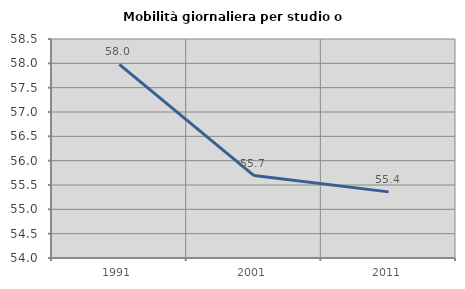
| Category | Mobilità giornaliera per studio o lavoro |
|---|---|
| 1991.0 | 57.977 |
| 2001.0 | 55.694 |
| 2011.0 | 55.359 |